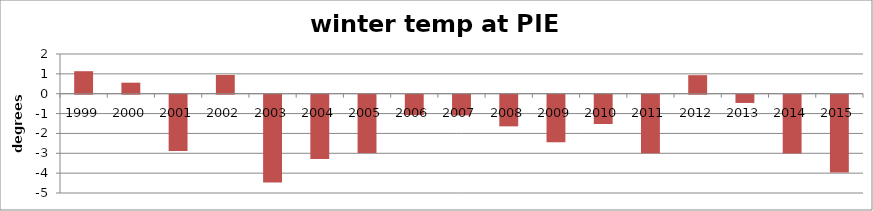
| Category | mean winter(djf)temp |
|---|---|
| 1999.0 | 1.133 |
| 2000.0 | 0.556 |
| 2001.0 | -2.83 |
| 2002.0 | 0.945 |
| 2003.0 | -4.419 |
| 2004.0 | -3.233 |
| 2005.0 | -2.936 |
| 2006.0 | -1.023 |
| 2007.0 | -1.041 |
| 2008.0 | -1.594 |
| 2009.0 | -2.395 |
| 2010.0 | -1.475 |
| 2011.0 | -2.943 |
| 2012.0 | 0.934 |
| 2013.0 | -0.415 |
| 2014.0 | -2.963 |
| 2015.0 | -3.917 |